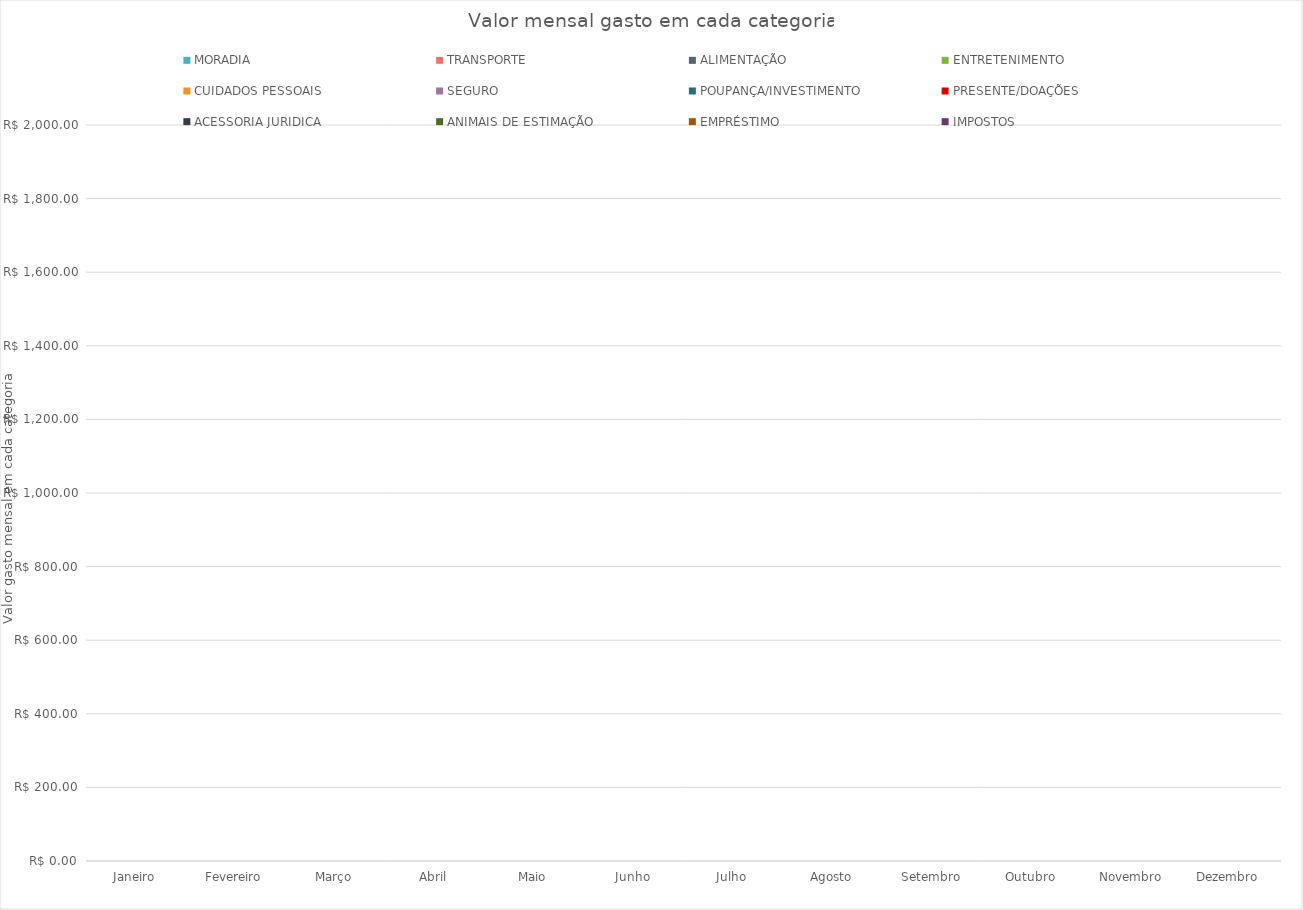
| Category | MORADIA | TRANSPORTE | ALIMENTAÇÃO | ENTRETENIMENTO | CUIDADOS PESSOAIS | SEGURO | POUPANÇA/INVESTIMENTO | PRESENTE/DOAÇÕES | ACESSORIA JURIDICA | ANIMAIS DE ESTIMAÇÃO | EMPRÉSTIMO | IMPOSTOS |
|---|---|---|---|---|---|---|---|---|---|---|---|---|
| Janeiro | 0 | 0 | 0 | 0 | 0 | 0 | 0 | 0 | 0 | 0 | 0 | 0 |
| Fevereiro | 0 | 0 | 0 | 0 | 0 | 0 | 0 | 0 | 0 | 0 | 0 | 0 |
| Março | 0 | 0 | 0 | 0 | 0 | 0 | 0 | 0 | 0 | 0 | 0 | 0 |
| Abril | 0 | 0 | 0 | 0 | 0 | 0 | 0 | 0 | 0 | 0 | 0 | 0 |
| Maio | 0 | 0 | 0 | 0 | 0 | 0 | 0 | 0 | 0 | 0 | 0 | 0 |
| Junho | 0 | 0 | 0 | 0 | 0 | 0 | 0 | 0 | 0 | 0 | 0 | 0 |
| Julho | 0 | 0 | 0 | 0 | 0 | 0 | 0 | 0 | 0 | 0 | 0 | 0 |
| Agosto | 0 | 0 | 0 | 0 | 0 | 0 | 0 | 0 | 0 | 0 | 0 | 0 |
| Setembro | 0 | 0 | 0 | 0 | 0 | 0 | 0 | 0 | 0 | 0 | 0 | 0 |
| Outubro | 0 | 0 | 0 | 0 | 0 | 0 | 0 | 0 | 0 | 0 | 0 | 0 |
| Novembro | 0 | 0 | 0 | 0 | 0 | 0 | 0 | 0 | 0 | 0 | 0 | 0 |
| Dezembro  | 0 | 0 | 0 | 0 | 0 | 0 | 0 | 0 | 0 | 0 | 0 | 0 |